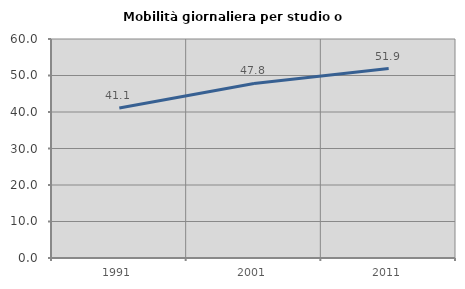
| Category | Mobilità giornaliera per studio o lavoro |
|---|---|
| 1991.0 | 41.093 |
| 2001.0 | 47.826 |
| 2011.0 | 51.908 |